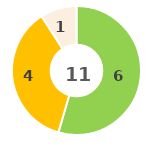
| Category | Series 0 |
|---|---|
| 0 | 0 |
| 1 | 6 |
| 2 | 4 |
| 3 | 0 |
| 4 | 1 |